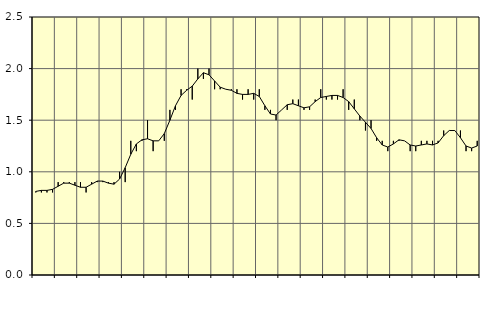
| Category | Piggar | Sysselsatta utomlands |
|---|---|---|
| nan | 0.8 | 0.81 |
| 1.0 | 0.8 | 0.82 |
| 1.0 | 0.8 | 0.82 |
| 1.0 | 0.8 | 0.83 |
| nan | 0.9 | 0.86 |
| 2.0 | 0.9 | 0.89 |
| 2.0 | 0.9 | 0.89 |
| 2.0 | 0.9 | 0.87 |
| nan | 0.9 | 0.85 |
| 3.0 | 0.8 | 0.85 |
| 3.0 | 0.9 | 0.88 |
| 3.0 | 0.9 | 0.91 |
| nan | 0.9 | 0.91 |
| 4.0 | 0.9 | 0.89 |
| 4.0 | 0.9 | 0.88 |
| 4.0 | 1 | 0.93 |
| nan | 0.9 | 1.04 |
| 5.0 | 1.3 | 1.17 |
| 5.0 | 1.2 | 1.27 |
| 5.0 | 1.3 | 1.31 |
| nan | 1.5 | 1.32 |
| 6.0 | 1.2 | 1.3 |
| 6.0 | 1.3 | 1.3 |
| 6.0 | 1.3 | 1.37 |
| nan | 1.6 | 1.5 |
| 7.0 | 1.6 | 1.64 |
| 7.0 | 1.8 | 1.74 |
| 7.0 | 1.8 | 1.79 |
| nan | 1.7 | 1.83 |
| 8.0 | 2 | 1.9 |
| 8.0 | 1.9 | 1.96 |
| 8.0 | 2 | 1.94 |
| nan | 1.8 | 1.88 |
| 9.0 | 1.8 | 1.82 |
| 9.0 | 1.8 | 1.8 |
| 9.0 | 1.8 | 1.79 |
| nan | 1.8 | 1.76 |
| 10.0 | 1.7 | 1.75 |
| 10.0 | 1.8 | 1.75 |
| 10.0 | 1.7 | 1.76 |
| nan | 1.8 | 1.73 |
| 11.0 | 1.6 | 1.64 |
| 11.0 | 1.6 | 1.56 |
| 11.0 | 1.5 | 1.55 |
| nan | 1.6 | 1.6 |
| 12.0 | 1.6 | 1.65 |
| 12.0 | 1.7 | 1.66 |
| 12.0 | 1.7 | 1.64 |
| nan | 1.6 | 1.62 |
| 13.0 | 1.6 | 1.63 |
| 13.0 | 1.7 | 1.68 |
| 13.0 | 1.8 | 1.72 |
| nan | 1.7 | 1.73 |
| 14.0 | 1.7 | 1.74 |
| 14.0 | 1.7 | 1.74 |
| 14.0 | 1.8 | 1.72 |
| nan | 1.6 | 1.68 |
| 15.0 | 1.7 | 1.61 |
| 15.0 | 1.5 | 1.54 |
| 15.0 | 1.4 | 1.48 |
| nan | 1.5 | 1.42 |
| 16.0 | 1.3 | 1.33 |
| 16.0 | 1.3 | 1.26 |
| 16.0 | 1.2 | 1.24 |
| nan | 1.3 | 1.27 |
| 17.0 | 1.3 | 1.31 |
| 17.0 | 1.3 | 1.3 |
| 17.0 | 1.2 | 1.26 |
| nan | 1.2 | 1.25 |
| 18.0 | 1.3 | 1.26 |
| 18.0 | 1.3 | 1.27 |
| 18.0 | 1.3 | 1.26 |
| nan | 1.3 | 1.28 |
| 19.0 | 1.4 | 1.35 |
| 19.0 | 1.4 | 1.4 |
| 19.0 | 1.4 | 1.4 |
| nan | 1.4 | 1.33 |
| 20.0 | 1.2 | 1.25 |
| 20.0 | 1.2 | 1.23 |
| 20.0 | 1.3 | 1.25 |